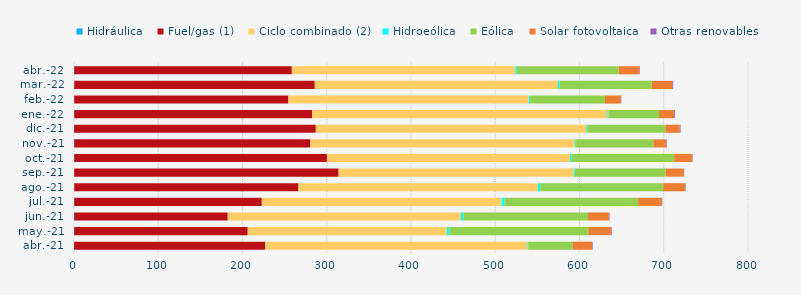
| Category | Hidráulica | Fuel/gas (1) | Ciclo combinado (2) | Hidroeólica | Eólica | Solar fotovoltaica | Otras renovables |
|---|---|---|---|---|---|---|---|
| abr.-21 | 0.138 | 226.895 | 311.21 | 0.836 | 53.036 | 22.758 | 0.722 |
| may.-21 | 0.268 | 205.958 | 236.283 | 3.227 | 164.671 | 27.093 | 0.723 |
| jun.-21 | 0.282 | 182.213 | 276.616 | 3.002 | 148.018 | 24.742 | 0.724 |
| jul.-21 | 0.29 | 222.639 | 284.61 | 3.578 | 158.516 | 27.938 | 0.734 |
| ago.-21 | 0.281 | 266.149 | 284.301 | 2.663 | 145.95 | 26.121 | 0.57 |
| sep.-21 | 0.278 | 313.815 | 278.888 | 1.42 | 107.853 | 21.565 | 0.4 |
| oct.-21 | 0.282 | 299.917 | 288.429 | 1.853 | 121.987 | 20.979 | 0.756 |
| nov.-21 | 0.231 | 280.341 | 314.273 | 1.14 | 91.77 | 14.946 | 0.753 |
| dic.-21 | 0.155 | 286.856 | 321.013 | 1.228 | 92.868 | 16.937 | 0.822 |
| ene.-22 | 0.294 | 282.523 | 350.314 | 1.111 | 60.148 | 17.957 | 0.861 |
| feb.-22 | 0.251 | 254.215 | 285.333 | 1.482 | 88.97 | 18.69 | 0.721 |
| mar.-22 | 0.296 | 285.489 | 288.518 | 2.126 | 108.992 | 24.856 | 0.91 |
| abr.-22 | 0.274 | 258.292 | 265.373 | 1.753 | 120.763 | 24.757 | 0.614 |